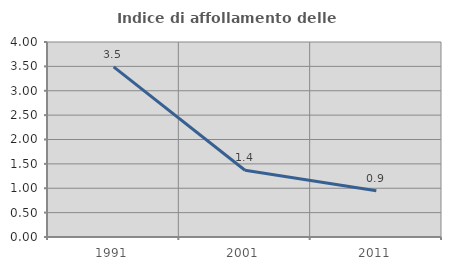
| Category | Indice di affollamento delle abitazioni  |
|---|---|
| 1991.0 | 3.488 |
| 2001.0 | 1.37 |
| 2011.0 | 0.947 |